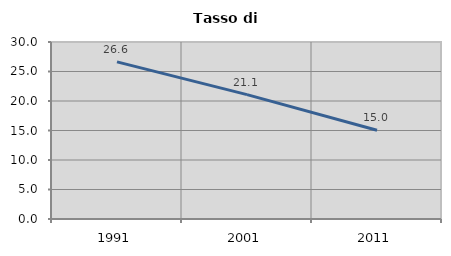
| Category | Tasso di disoccupazione   |
|---|---|
| 1991.0 | 26.635 |
| 2001.0 | 21.077 |
| 2011.0 | 15.04 |